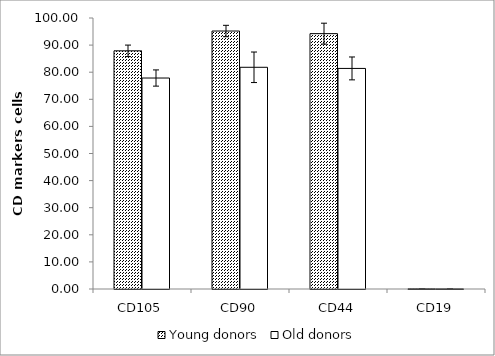
| Category | Young donors | Old donors |
|---|---|---|
| CD105 | 87.882 | 77.851 |
| CD90 | 95.193 | 81.813 |
| CD44 | 94.227 | 81.393 |
| CD19 | 0.077 | 0.043 |